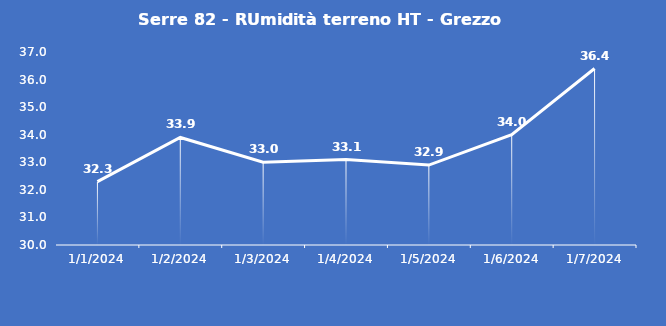
| Category | Serre 82 - RUmidità terreno HT - Grezzo (%VWC) |
|---|---|
| 1/1/24 | 32.3 |
| 1/2/24 | 33.9 |
| 1/3/24 | 33 |
| 1/4/24 | 33.1 |
| 1/5/24 | 32.9 |
| 1/6/24 | 34 |
| 1/7/24 | 36.4 |